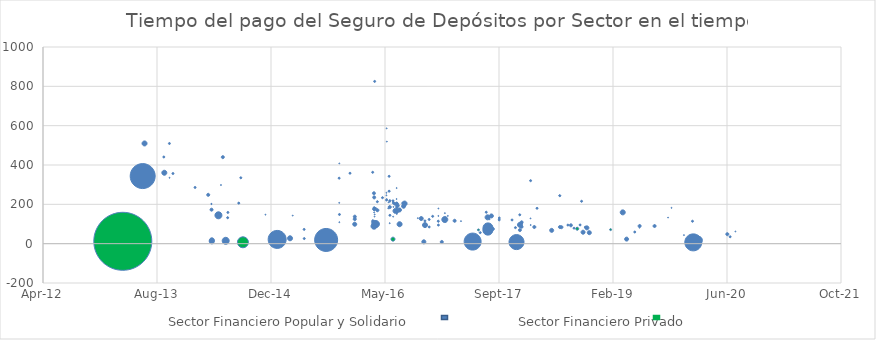
| Category | Costo contingente |
|---|---|
| 42453.0 | 827 |
| 42506.0 | 588 |
| 42507.0 | 520 |
| 41445.0 | 510 |
| 41553.0 | 511 |
| 41787.0 | 442 |
| 41528.0 | 443 |
| 42298.0 | 410 |
| 42445.0 | 364 |
| 41437.0 | 344 |
| 41568.0 | 359 |
| 42345.0 | 360 |
| 42516.0 | 345 |
| 42298.0 | 334 |
| 41530.0 | 363 |
| 41866.0 | 337 |
| 41555.0 | 335 |
| 43138.0 | 321 |
| 41779.0 | 300 |
| 41666.0 | 287 |
| 42551.0 | 283 |
| 42516.0 | 269 |
| 42520.0 | 267 |
| 42450.0 | 258 |
| 42506.0 | 259 |
| 43265.0 | 246 |
| 43265.0 | 246 |
| 42506.0 | 246 |
| 42451.0 | 237 |
| 41724.0 | 249 |
| 42488.0 | 235 |
| 42507.0 | 227 |
| 42550.0 | 228 |
| 42520.0 | 220 |
| 43361.0 | 217 |
| 42506.0 | 223 |
| 42465.0 | 215 |
| 42535.0 | 215 |
| 42535.0 | 218 |
| 42535.0 | 209 |
| 42520.0 | 214 |
| 42514.0 | 212 |
| 42550.0 | 205 |
| 42542.0 | 204 |
| 42550.0 | 206 |
| 42298.0 | 209 |
| 42550.0 | 199 |
| 42550.0 | 205 |
| 42576.0 | 209 |
| 42585.0 | 205 |
| 41738.0 | 203 |
| 42555.0 | 195 |
| 41738.0 | 202 |
| 42550.0 | 196 |
| 42542.0 | 202 |
| 42520.0 | 188 |
| 42535.0 | 189 |
| 43755.0 | 184 |
| 42451.0 | 185 |
| 42520.0 | 187 |
| 42733.0 | 180 |
| 42458.0 | 180 |
| 42514.0 | 180 |
| 43165.0 | 182 |
| 42550.0 | 191 |
| 42551.0 | 185 |
| 41857.0 | 208 |
| 41857.0 | 208 |
| 42551.0 | 185 |
| 42450.0 | 179 |
| 42465.0 | 172 |
| 42451.0 | 176 |
| 42453.0 | 174 |
| 42551.0 | 173 |
| 42551.0 | 164 |
| 42544.0 | 169 |
| 42563.0 | 172 |
| 41809.0 | 161 |
| 43542.0 | 160 |
| 42550.0 | 167 |
| 42762.0 | 156 |
| 41739.0 | 173 |
| 42453.0 | 151 |
| 42944.0 | 160 |
| 42298.0 | 151 |
| 42580.0 | 192 |
| 42094.0 | 144 |
| 42551.0 | 152 |
| 42451.0 | 161 |
| 42520.0 | 146 |
| 41768.0 | 146 |
| 42774.0 | 143 |
| 41975.0 | 148 |
| 43090.0 | 148 |
| 42535.0 | 138 |
| 42965.0 | 143 |
| 43741.0 | 133 |
| 42367.0 | 138 |
| 42733.0 | 142 |
| 42453.0 | 139 |
| 42949.0 | 135 |
| 42643.0 | 131 |
| 42957.0 | 126 |
| 43000.0 | 132 |
| 42709.0 | 139 |
| 42367.0 | 125 |
| 43138.0 | 129 |
| 42445.0 | 119 |
| 43847.0 | 116 |
| 42657.0 | 130 |
| 41809.0 | 133 |
| 41809.0 | 133 |
| 42692.0 | 125 |
| 43056.0 | 122 |
| 42832.0 | 116 |
| 43000.0 | 122 |
| 42762.0 | 123 |
| 42804.0 | 118 |
| 42733.0 | 115 |
| 42520.0 | 105 |
| 42445.0 | 114 |
| 42675.0 | 116 |
| 42733.0 | 114 |
| 43098.0 | 110 |
| 43097.0 | 106 |
| 42298.0 | 111 |
| 42445.0 | 107 |
| 42367.0 | 99 |
| 42563.0 | 100 |
| 42459.0 | 101 |
| 42453.0 | 106 |
| 43090.0 | 98 |
| 43138.0 | 96 |
| 43301.0 | 96 |
| 43314.0 | 95 |
| 42675.0 | 95 |
| 43355.0 | 96 |
| 43615.0 | 92 |
| 43682.0 | 90 |
| 42733.0 | 96 |
| 43615.0 | 82 |
| 43097.0 | 88 |
| 43377.0 | 86 |
| 42445.0 | 93 |
| 43153.0 | 87 |
| 42450.0 | 91 |
| 42692.0 | 87 |
| 43341.0 | 81 |
| 43070.0 | 84 |
| 42951.0 | 81 |
| 43328.0 | 80 |
| 43265.0 | 87 |
| 43272.0 | 86 |
| 43385.0 | 81 |
| 42144.0 | 74 |
| 43343.0 | 76 |
| 43489.0 | 72 |
| 42909.0 | 71 |
| 43229.0 | 70 |
| 42972.0 | 76 |
| 43090.0 | 71 |
| 42951.0 | 69 |
| 43594.0 | 61 |
| 44035.0 | 64 |
| 42916.0 | 58 |
| 43368.0 | 59 |
| 44000.0 | 50 |
| 43396.0 | 56 |
| 43810.0 | 45 |
| 44013.0 | 36 |
| 42144.0 | 28 |
| 42025.0 | 24 |
| 42083.0 | 28 |
| 43851.0 | 20 |
| 43558.0 | 25 |
| 42240.0 | 21 |
| 43873.0 | 19 |
| 41739.0 | 13 |
| 43851.0 | 16 |
| 41739.0 | 19 |
| 41800.0 | 16 |
| 42240.0 | 22 |
| 43076.0 | 9 |
| 42669.0 | 11 |
| 43851.0 | 8 |
| 42748.0 | 10 |
| 42884.0 | 11 |
| 42534.0 | 24 |
| 41350.0 | 12 |
| 41876.0 | 8 |